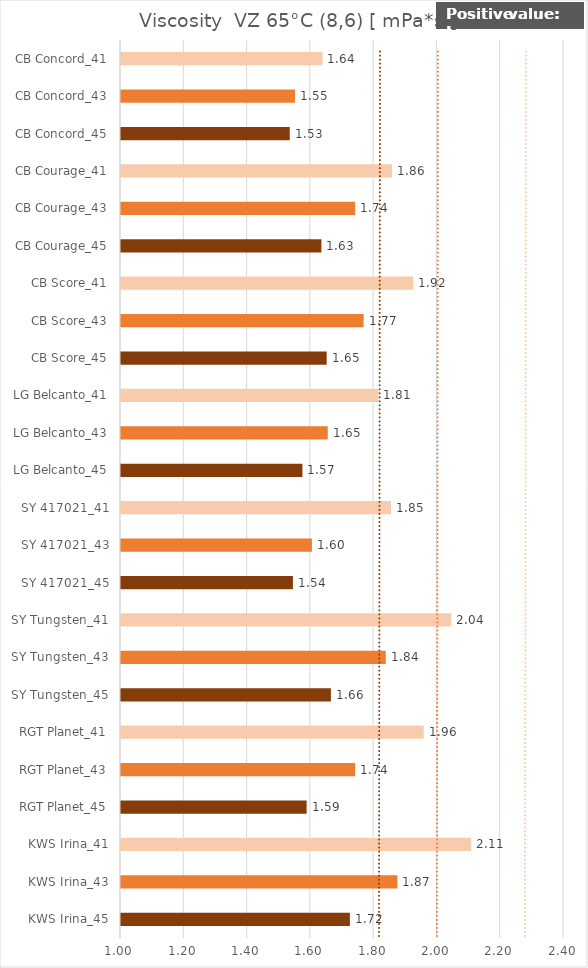
| Category |   Viscosity  VZ 65°C (8,6) [ mPa*s ] |
|---|---|
| KWS Irina_45 | 1.723 |
| KWS Irina_43 | 1.873 |
| KWS Irina_41 | 2.107 |
| RGT Planet_45 | 1.587 |
| RGT Planet_43 | 1.74 |
| RGT Planet_41 | 1.957 |
| SY Tungsten_45 | 1.663 |
| SY Tungsten_43 | 1.837 |
| SY Tungsten_41 | 2.043 |
| SY 417021_45 | 1.543 |
| SY 417021_43 | 1.603 |
| SY 417021_41 | 1.853 |
| LG Belcanto_45 | 1.573 |
| LG Belcanto_43 | 1.653 |
| LG Belcanto_41 | 1.813 |
| CB Score_45 | 1.65 |
| CB Score_43 | 1.767 |
| CB Score_41 | 1.923 |
| CB Courage_45 | 1.633 |
| CB Courage_43 | 1.74 |
| CB Courage_41 | 1.857 |
| CB Concord_45 | 1.533 |
| CB Concord_43 | 1.55 |
| CB Concord_41 | 1.637 |